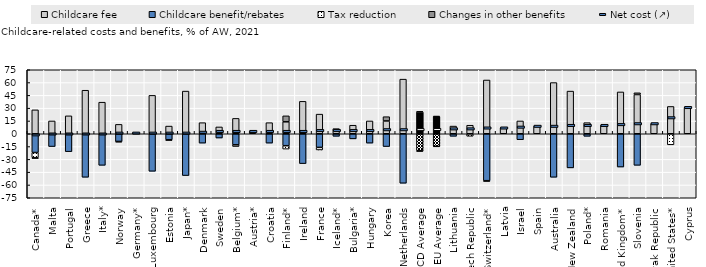
| Category | Childcare fee | Childcare benefit/rebates | Tax reduction | Changes in other benefits |
|---|---|---|---|---|
| Canada* | 28 | -22 | -6 | -1 |
| Malta | 15 | -15 | 0 | 0 |
| Portugal | 21 | -21 | 0 | 0 |
| Greece | 51 | -51 | 0 | 0 |
| Italy* | 37 | -37 | 0 | 0 |
| Norway | 11 | -9 | -1 | 0 |
| Germany* | 1 | 0 | 0 | 0 |
| Luxembourg | 45 | -44 | 0 | 0 |
| Estonia | 9 | -7 | -1 | 0 |
| Japan* | 50 | -49 | 0 | 0 |
| Denmark | 13 | -11 | 0 | 0 |
| Sweden | 8 | -5 | 0 | 0 |
| Belgium* | 18 | -13 | -2 | 0 |
| Austria* | 3 | 0 | 0 | 0 |
| Croatia | 13 | -11 | 0 | 0 |
| Finland* | 14 | -14 | -4 | 7 |
| Ireland | 38 | -35 | 0 | 0 |
| France | 23 | -16 | -3 | 0 |
| Iceland* | 6 | -3 | 0 | 0 |
| Bulgaria* | 10 | -6 | 0 | 0 |
| Hungary | 15 | -11 | 0 | 0 |
| Korea | 15 | -15 | 0 | 5 |
| Netherlands | 64 | -58 | 0 | 0 |
| OECD Average | 25.606 | -19.879 | -1.03 | 0.394 |
| EU Average | 20.185 | -14.741 | -0.481 | 0.333 |
| Lithuania | 9 | -3 | 0 | 0 |
| Czech Republic | 10 | 0 | -3 | 0 |
| Switzerland* | 63 | -55 | -1 | 0 |
| Latvia | 7 | 0 | 0 | 0 |
| Israel | 15 | -7 | 0 | 0 |
| Spain | 9 | 0 | 0 | 0 |
| Australia | 60 | -51 | 0 | 0 |
| New Zealand | 50 | -40 | 0 | 0 |
| Poland* | 13 | -3 | 0 | 0 |
| Romania | 10 | 0 | 0 | 0 |
| United Kingdom* | 49 | -39 | 0 | 0 |
| Slovenia | 46 | -37 | 0 | 2 |
| Slovak Republic | 12 | 0 | 0 | 0 |
| United States* | 32 | 0 | -13 | 0 |
| Cyprus | 31 | 0 | 0 | 0 |